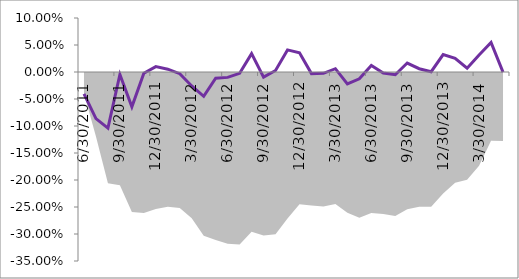
| Category | Series 1 |
|---|---|
| 0 | -0.041 |
| 01/01/1900 | -0.086 |
| 02/01/1900 | -0.104 |
| 03/01/1900 | -0.005 |
| 04/01/1900 | -0.064 |
| 05/01/1900 | -0.002 |
| 06/01/1900 | 0.01 |
| 07/01/1900 | 0.005 |
| 08/01/1900 | -0.003 |
| 09/01/1900 | -0.026 |
| 10/01/1900 | -0.045 |
| 11/01/1900 | -0.012 |
| 12/01/1900 | -0.01 |
| 13/01/1900 | -0.002 |
| 14/01/1900 | 0.034 |
| 15/01/1900 | -0.009 |
| 16/01/1900 | 0.003 |
| 17/01/1900 | 0.041 |
| 18/01/1900 | 0.036 |
| 19/01/1900 | -0.003 |
| 20/01/1900 | -0.002 |
| 21/01/1900 | 0.006 |
| 22/01/1900 | -0.022 |
| 23/01/1900 | -0.013 |
| 24/01/1900 | 0.012 |
| 25/01/1900 | -0.002 |
| 26/01/1900 | -0.005 |
| 27/01/1900 | 0.017 |
| 28/01/1900 | 0.006 |
| 29/01/1900 | 0.001 |
| 30/01/1900 | 0.032 |
| 31/01/1900 | 0.025 |
| 01/02/1900 | 0.007 |
| 02/02/1900 | 0.032 |
| 03/02/1900 | 0.055 |
| 04/02/1900 | 0 |